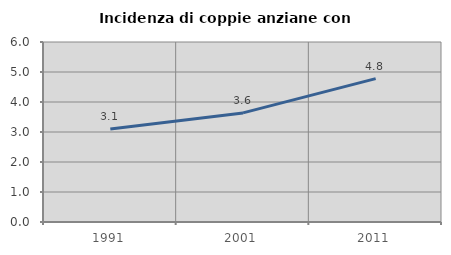
| Category | Incidenza di coppie anziane con figli |
|---|---|
| 1991.0 | 3.097 |
| 2001.0 | 3.636 |
| 2011.0 | 4.778 |